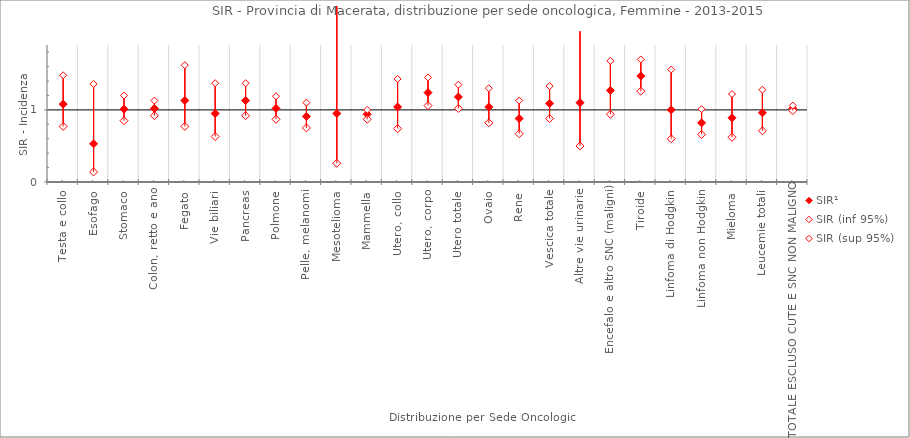
| Category | SIR¹ | SIR (inf 95%) | SIR (sup 95%) |
|---|---|---|---|
| Testa e collo | 1.08 | 0.77 | 1.48 |
| Esofago | 0.53 | 0.14 | 1.36 |
| Stomaco | 1.01 | 0.85 | 1.2 |
| Colon, retto e ano | 1.02 | 0.92 | 1.13 |
| Fegato | 1.13 | 0.77 | 1.62 |
| Vie biliari | 0.95 | 0.63 | 1.37 |
| Pancreas | 1.13 | 0.92 | 1.37 |
| Polmone | 1.02 | 0.87 | 1.19 |
| Pelle, melanomi | 0.91 | 0.75 | 1.1 |
| Mesotelioma | 0.95 | 0.26 | 2.44 |
| Mammella | 0.94 | 0.87 | 1 |
| Utero, collo | 1.04 | 0.74 | 1.43 |
| Utero, corpo | 1.24 | 1.06 | 1.45 |
| Utero totale | 1.18 | 1.02 | 1.35 |
| Ovaio | 1.04 | 0.82 | 1.3 |
| Rene | 0.88 | 0.67 | 1.13 |
| Vescica totale | 1.09 | 0.88 | 1.33 |
| Altre vie urinarie | 1.1 | 0.5 | 2.09 |
| Encefalo e altro SNC (maligni) | 1.27 | 0.94 | 1.68 |
| Tiroide | 1.47 | 1.26 | 1.7 |
| Linfoma di Hodgkin | 1 | 0.6 | 1.56 |
| Linfoma non Hodgkin | 0.82 | 0.66 | 1.01 |
| Mieloma | 0.89 | 0.62 | 1.22 |
| Leucemie totali | 0.96 | 0.71 | 1.28 |
| TOTALE ESCLUSO CUTE E SNC NON MALIGNO | 1.02 | 0.99 | 1.06 |